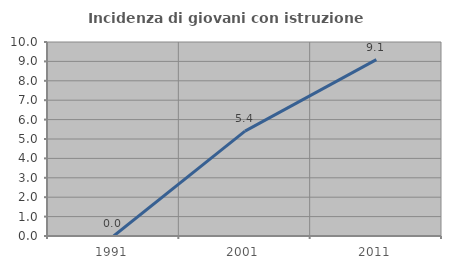
| Category | Incidenza di giovani con istruzione universitaria |
|---|---|
| 1991.0 | 0 |
| 2001.0 | 5.405 |
| 2011.0 | 9.091 |